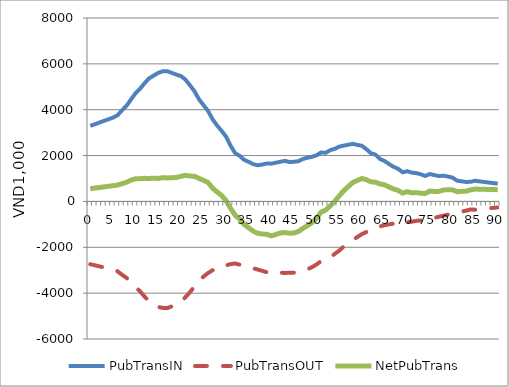
| Category | PubTransIN | PubTransOUT | NetPubTrans |
|---|---|---|---|
| 0.0 | 3294.451 | -2739.646 | 554.805 |
| 1.0 | 3366.452 | -2785.412 | 581.039 |
| 2.0 | 3438.452 | -2831.179 | 607.274 |
| 3.0 | 3510.453 | -2876.945 | 633.508 |
| 4.0 | 3582.454 | -2922.711 | 659.743 |
| 5.0 | 3654.454 | -2968.477 | 685.977 |
| 6.0 | 3754.493 | -3043.321 | 711.172 |
| 7.0 | 3970.123 | -3196.043 | 774.08 |
| 8.0 | 4169.383 | -3333.595 | 835.789 |
| 9.0 | 4446.518 | -3515.142 | 931.376 |
| 10.0 | 4719.546 | -3730.571 | 988.975 |
| 11.0 | 4914.15 | -3921.727 | 992.423 |
| 12.0 | 5158.492 | -4150.811 | 1007.681 |
| 13.0 | 5366.188 | -4366.24 | 999.948 |
| 14.0 | 5488.761 | -4477.495 | 1011.266 |
| 15.0 | 5606.1 | -4604.426 | 1001.673 |
| 16.0 | 5675.705 | -4641.848 | 1033.857 |
| 17.0 | 5681.499 | -4654.997 | 1026.502 |
| 18.0 | 5606.317 | -4576.613 | 1029.704 |
| 19.0 | 5532.914 | -4487.609 | 1045.305 |
| 20.0 | 5470.388 | -4377.871 | 1092.516 |
| 21.0 | 5319.922 | -4179.636 | 1140.286 |
| 22.0 | 5070.07 | -3963.195 | 1106.875 |
| 23.0 | 4812.696 | -3713.883 | 1098.813 |
| 24.0 | 4460.571 | -3453.952 | 1006.619 |
| 25.0 | 4200.415 | -3281.507 | 918.908 |
| 26.0 | 3952.279 | -3124.233 | 828.045 |
| 27.0 | 3589.243 | -3002.865 | 586.378 |
| 28.0 | 3312.208 | -2896.161 | 416.046 |
| 29.0 | 3081.75 | -2821.317 | 260.433 |
| 30.0 | 2822.988 | -2789.458 | 33.53 |
| 31.0 | 2428.955 | -2733.325 | -304.37 |
| 32.0 | 2104.377 | -2707.534 | -603.157 |
| 33.0 | 1987.632 | -2758.61 | -770.978 |
| 34.0 | 1811.859 | -2820.812 | -1008.953 |
| 35.0 | 1725.547 | -2877.956 | -1152.409 |
| 36.0 | 1623.269 | -2918.918 | -1295.649 |
| 37.0 | 1577.508 | -2969.994 | -1392.486 |
| 38.0 | 1608.984 | -3027.644 | -1418.66 |
| 39.0 | 1655.378 | -3089.34 | -1433.962 |
| 40.0 | 1647.742 | -3151.036 | -1503.294 |
| 41.0 | 1689.286 | -3130.302 | -1441.016 |
| 42.0 | 1730.961 | -3107.545 | -1376.585 |
| 43.0 | 1767.993 | -3123.728 | -1355.735 |
| 44.0 | 1720.205 | -3108.557 | -1388.352 |
| 45.0 | 1728.706 | -3106.534 | -1377.828 |
| 46.0 | 1756.911 | -3065.066 | -1308.155 |
| 47.0 | 1854.348 | -3024.61 | -1170.262 |
| 48.0 | 1906.056 | -2957.857 | -1051.801 |
| 49.0 | 1944.638 | -2865.314 | -920.676 |
| 50.0 | 2015.441 | -2744.956 | -729.515 |
| 51.0 | 2135.361 | -2598.808 | -463.447 |
| 52.0 | 2120.117 | -2495.139 | -375.022 |
| 53.0 | 2237.532 | -2436.477 | -198.945 |
| 54.0 | 2293.684 | -2288.306 | 5.378 |
| 55.0 | 2388.836 | -2141.652 | 247.184 |
| 56.0 | 2434.167 | -1964.151 | 470.016 |
| 57.0 | 2472.349 | -1822.048 | 650.3 |
| 58.0 | 2511.679 | -1682.474 | 829.205 |
| 59.0 | 2464.811 | -1550.991 | 913.819 |
| 60.0 | 2428.055 | -1424.06 | 1003.996 |
| 61.0 | 2275.699 | -1332.022 | 943.677 |
| 62.0 | 2101.013 | -1247.064 | 853.949 |
| 63.0 | 2041.694 | -1203.068 | 838.626 |
| 64.0 | 1847.943 | -1088.779 | 759.164 |
| 65.0 | 1762.418 | -1036.186 | 726.233 |
| 66.0 | 1628.849 | -999.269 | 629.579 |
| 67.0 | 1510.017 | -967.41 | 542.607 |
| 68.0 | 1421.72 | -940.608 | 481.112 |
| 69.0 | 1271.686 | -909.76 | 361.926 |
| 70.0 | 1316.765 | -890.543 | 426.222 |
| 71.0 | 1257.887 | -882.958 | 374.929 |
| 72.0 | 1234.836 | -848.57 | 386.266 |
| 73.0 | 1183.182 | -827.33 | 355.851 |
| 74.0 | 1112.147 | -764.623 | 347.524 |
| 75.0 | 1194.525 | -742.878 | 451.647 |
| 76.0 | 1147.437 | -714.053 | 433.384 |
| 77.0 | 1108.038 | -669.551 | 438.487 |
| 78.0 | 1120.601 | -623.026 | 497.575 |
| 79.0 | 1086.392 | -577.007 | 509.385 |
| 80.0 | 1040.29 | -530.483 | 509.807 |
| 81.0 | 908.177 | -482.946 | 425.23 |
| 82.0 | 877.839 | -439.456 | 438.383 |
| 83.0 | 849.94 | -405.574 | 444.366 |
| 84.0 | 855.215 | -348.935 | 506.28 |
| 85.0 | 900.179 | -361.578 | 538.601 |
| 86.0 | 874.877 | -341.4 | 533.477 |
| 87.0 | 849.574 | -321.223 | 528.352 |
| 88.0 | 824.272 | -301.045 | 523.227 |
| 89.0 | 798.97 | -280.867 | 518.103 |
| 90.0 | 773.668 | -260.69 | 512.978 |